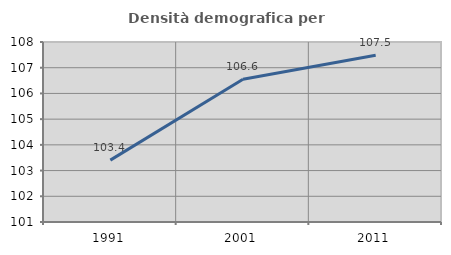
| Category | Densità demografica |
|---|---|
| 1991.0 | 103.407 |
| 2001.0 | 106.551 |
| 2011.0 | 107.486 |